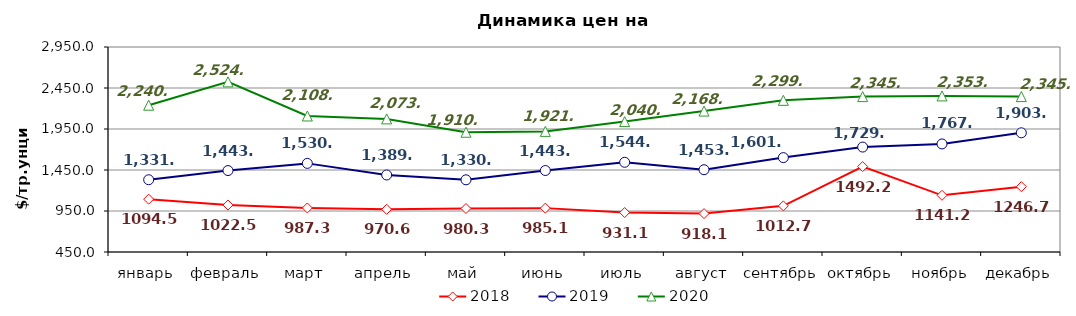
| Category | 2018 | 2019 | 2020 |
|---|---|---|---|
| январь | 1094.45 | 1331.18 | 2240.18 |
| февраль | 1022.45 | 1443.15 | 2524.7 |
| март | 987.33 | 1530.71 | 2108.9 |
| апрель | 970.55 | 1389.3 | 2073.15 |
| май | 980.3 | 1330.238 | 1910.438 |
| июнь | 985.05 | 1443.85 | 1920.955 |
| июль | 931.14 | 1544 | 2040.391 |
| август | 918.09 | 1453.429 | 2168.55 |
| сентябрь | 1012.65 | 1601.095 | 2299.636 |
| октябрь | 1492.18 | 1729.545 | 2345.182 |
| ноябрь | 1141.2 | 1767.762 | 2353.238 |
| декабрь | 1246.72 | 1903.61 | 2345.429 |